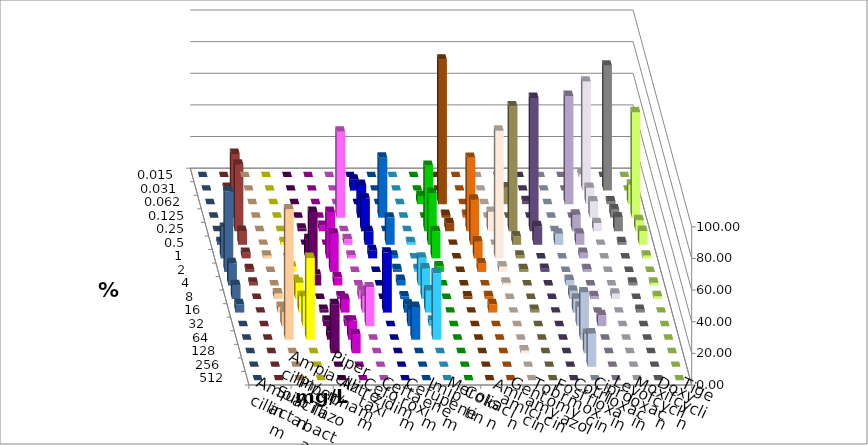
| Category | Ampicillin | Ampicillin/ Sulbactam | Piperacillin | Piperacillin/ Tazobactam | Aztreonam | Cefotaxim | Ceftazidim | Cefuroxim | Imipenem | Meropenem | Colistin | Amikacin | Gentamicin | Tobramycin | Fosfomycin | Cotrimoxazol | Ciprofloxacin | Levofloxacin | Moxifloxacin | Doxycyclin | Tigecyclin |
|---|---|---|---|---|---|---|---|---|---|---|---|---|---|---|---|---|---|---|---|---|---|
| 0.015 | 0 | 0 | 0 | 0 | 0 | 0 | 0 | 0 | 0 | 0 | 0 | 0 | 0 | 0 | 0 | 0 | 1.724 | 0 | 0 | 0 | 0 |
| 0.031 | 0 | 0 | 0 | 0 | 0 | 6.897 | 0 | 0 | 0 | 0 | 0 | 0 | 0 | 0 | 0 | 0 | 68.966 | 78.947 | 0 | 0 | 1.754 |
| 0.062 | 0 | 0 | 0 | 0 | 0 | 0 | 0 | 0 | 5.172 | 91.379 | 0 | 0 | 10.526 | 1.961 | 0 | 68.421 | 10.345 | 1.754 | 12.281 | 0 | 0 |
| 0.125 | 0 | 0 | 0 | 0 | 54.386 | 20.69 | 37.931 | 0 | 0 | 1.724 | 1.786 | 0 | 0 | 0 | 0 | 0 | 10.345 | 5.263 | 66.667 | 0 | 40.351 |
| 0.25 | 0 | 0 | 1.724 | 3.448 | 0 | 20.69 | 0 | 0 | 41.379 | 5.172 | 46.429 | 12.281 | 78.947 | 84.314 | 0 | 10.526 | 5.172 | 8.772 | 7.018 | 0 | 42.105 |
| 0.5 | 0 | 1.724 | 0 | 0 | 3.509 | 8.621 | 17.241 | 1.754 | 32.759 | 0 | 28.571 | 0 | 5.263 | 11.765 | 7.018 | 7.018 | 0 | 1.754 | 8.772 | 1.754 | 8.772 |
| 1.0 | 1.754 | 0 | 12.069 | 29.31 | 1.754 | 5.172 | 1.724 | 0 | 17.241 | 0 | 10.714 | 80.702 | 1.754 | 0 | 0 | 3.509 | 0 | 0 | 1.754 | 19.298 | 3.509 |
| 2.0 | 0 | 3.448 | 37.931 | 24.138 | 0 | 0 | 1.724 | 1.754 | 3.448 | 0 | 5.357 | 3.509 | 1.754 | 1.961 | 0 | 1.754 | 0 | 0 | 0 | 50.877 | 1.754 |
| 4.0 | 0 | 3.448 | 6.897 | 5.172 | 0 | 0 | 3.448 | 17.544 | 0 | 0 | 0 | 1.754 | 0 | 0 | 3.509 | 0 | 0 | 1.754 | 1.754 | 14.035 | 1.754 |
| 8.0 | 3.509 | 10.345 | 0 | 1.724 | 5.263 | 0 | 1.724 | 19.298 | 0 | 1.724 | 1.786 | 0 | 0 | 0 | 5.263 | 1.754 | 3.448 | 0 | 1.754 | 8.772 | 0 |
| 16.0 | 3.509 | 10.345 | 1.724 | 8.621 | 10.526 | 37.931 | 5.172 | 14.035 | 0 | 0 | 5.357 | 0 | 1.754 | 0 | 8.772 | 0 | 0 | 1.754 | 0 | 5.263 | 0 |
| 32.0 | 8.772 | 18.966 | 3.448 | 3.448 | 24.561 | 0 | 10.345 | 3.509 | 0 | 0 | 0 | 0 | 0 | 0 | 12.281 | 7.018 | 0 | 0 | 0 | 0 | 0 |
| 64.0 | 82.456 | 51.724 | 5.172 | 12.069 | 0 | 0 | 20.69 | 42.105 | 0 | 0 | 0 | 0 | 0 | 0 | 29.825 | 0 | 0 | 0 | 0 | 0 | 0 |
| 128.0 | 0 | 0 | 31.034 | 12.069 | 0 | 0 | 0 | 0 | 0 | 0 | 0 | 1.754 | 0 | 0 | 12.281 | 0 | 0 | 0 | 0 | 0 | 0 |
| 256.0 | 0 | 0 | 0 | 0 | 0 | 0 | 0 | 0 | 0 | 0 | 0 | 0 | 0 | 0 | 21.053 | 0 | 0 | 0 | 0 | 0 | 0 |
| 512.0 | 0 | 0 | 0 | 0 | 0 | 0 | 0 | 0 | 0 | 0 | 0 | 0 | 0 | 0 | 0 | 0 | 0 | 0 | 0 | 0 | 0 |